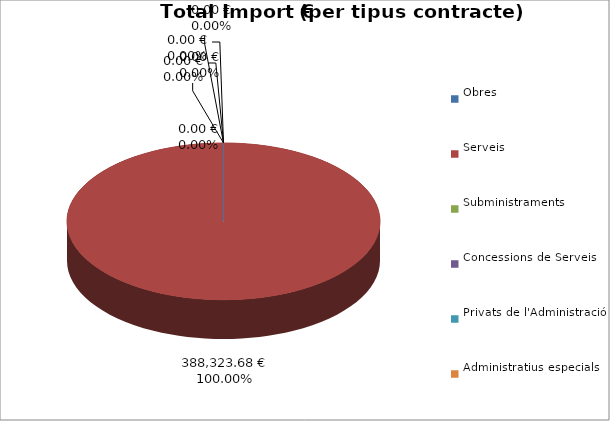
| Category | Total preu
(amb IVA) |
|---|---|
| Obres | 0 |
| Serveis | 388323.68 |
| Subministraments | 0 |
| Concessions de Serveis | 0 |
| Privats de l'Administració | 0 |
| Administratius especials | 0 |